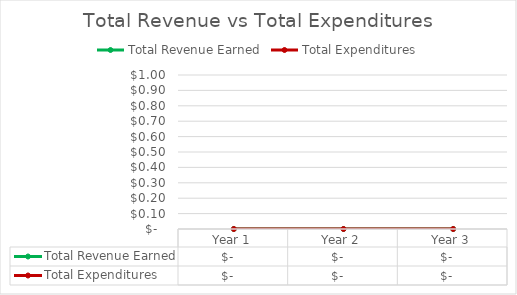
| Category | Total Revenue Earned | Total Expenditures |
|---|---|---|
| Year 1 | 0 | 0 |
| Year 2 | 0 | 0 |
| Year 3 | 0 | 0 |